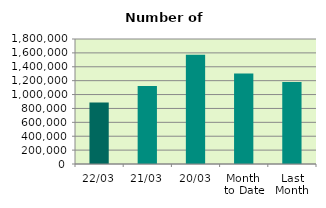
| Category | Series 0 |
|---|---|
| 22/03 | 883830 |
| 21/03 | 1123880 |
| 20/03 | 1573122 |
| Month 
to Date | 1303386.5 |
| Last
Month | 1180310.4 |